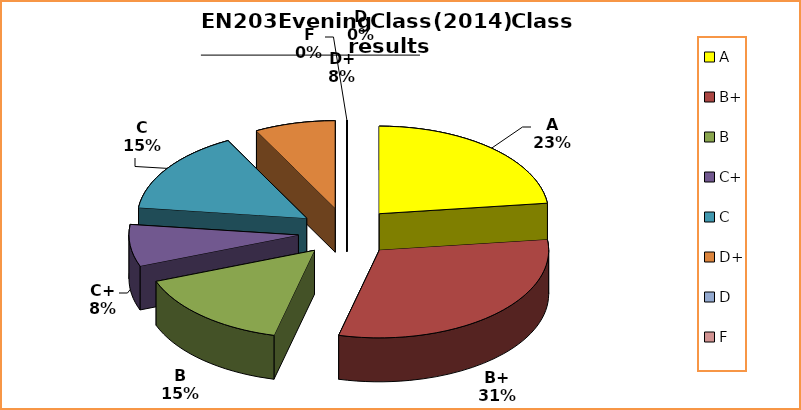
| Category | Series 0 |
|---|---|
| A | 3 |
| B+ | 4 |
| B | 2 |
| C+ | 1 |
| C | 2 |
| D+ | 1 |
| D | 0 |
| F | 0 |